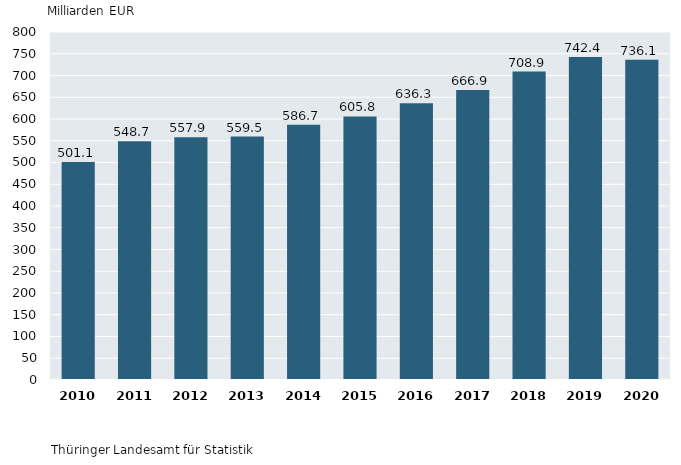
| Category | 2. Bruttoanlageinvestitionen in Deutschland 2010 bis 2020 in jeweiligen Preisen |
|---|---|
| 2010.0 | 501.148 |
| 2011.0 | 548.701 |
| 2012.0 | 557.877 |
| 2013.0 | 559.5 |
| 2014.0 | 586.665 |
| 2015.0 | 605.836 |
| 2016.0 | 636.299 |
| 2017.0 | 666.876 |
| 2018.0 | 708.939 |
| 2019.0 | 742.361 |
| 2020.0 | 736.147 |